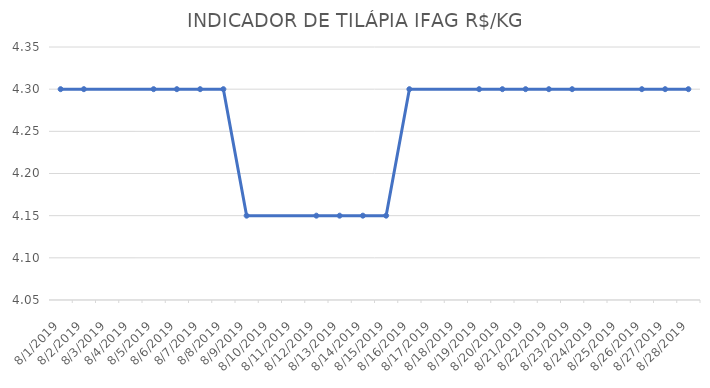
| Category | INDICADOR DE TILÁPIA IFAG |
|---|---|
| 8/1/19 | 4.3 |
| 8/2/19 | 4.3 |
| 8/5/19 | 4.3 |
| 8/6/19 | 4.3 |
| 8/7/19 | 4.3 |
| 8/8/19 | 4.3 |
| 8/9/19 | 4.15 |
| 8/12/19 | 4.15 |
| 8/13/19 | 4.15 |
| 8/14/19 | 4.15 |
| 8/15/19 | 4.15 |
| 8/16/19 | 4.3 |
| 8/19/19 | 4.3 |
| 8/20/19 | 4.3 |
| 8/21/19 | 4.3 |
| 8/22/19 | 4.3 |
| 8/23/19 | 4.3 |
| 8/26/19 | 4.3 |
| 8/27/19 | 4.3 |
| 8/28/19 | 4.3 |